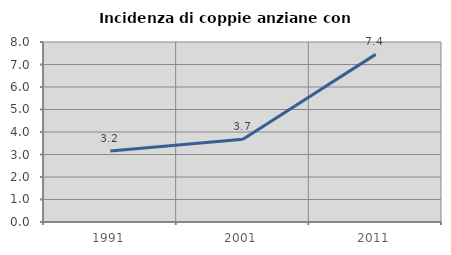
| Category | Incidenza di coppie anziane con figli |
|---|---|
| 1991.0 | 3.156 |
| 2001.0 | 3.678 |
| 2011.0 | 7.449 |